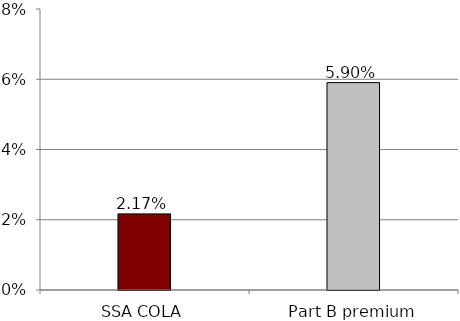
| Category | 2000-2020 |
|---|---|
| SSA COLA | 0.022 |
| Part B premium | 0.059 |